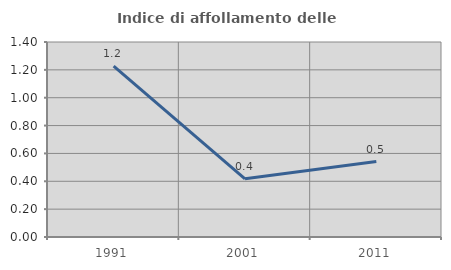
| Category | Indice di affollamento delle abitazioni  |
|---|---|
| 1991.0 | 1.227 |
| 2001.0 | 0.418 |
| 2011.0 | 0.542 |